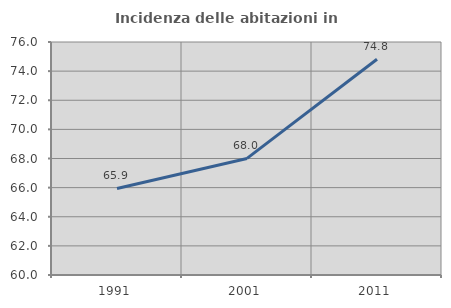
| Category | Incidenza delle abitazioni in proprietà  |
|---|---|
| 1991.0 | 65.941 |
| 2001.0 | 68.005 |
| 2011.0 | 74.815 |